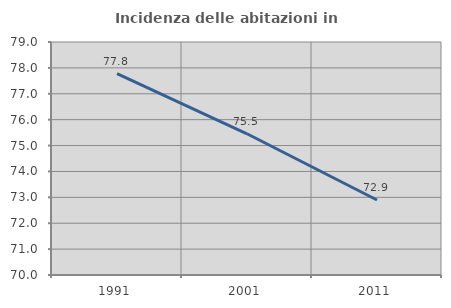
| Category | Incidenza delle abitazioni in proprietà  |
|---|---|
| 1991.0 | 77.778 |
| 2001.0 | 75.455 |
| 2011.0 | 72.897 |